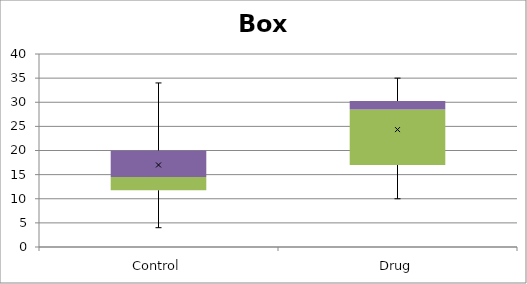
| Category | Min | Q1-Min | Med-Q1 | Q3-Med |
|---|---|---|---|---|
| Control | 4 | 7.75 | 2.75 | 5.5 |
| Drug | 10 | 7 | 11.5 | 1.75 |